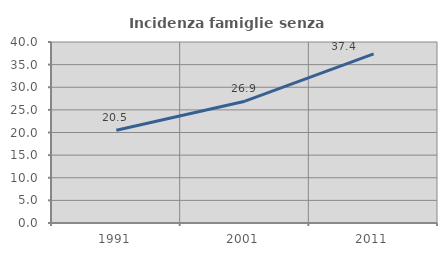
| Category | Incidenza famiglie senza nuclei |
|---|---|
| 1991.0 | 20.504 |
| 2001.0 | 26.921 |
| 2011.0 | 37.377 |